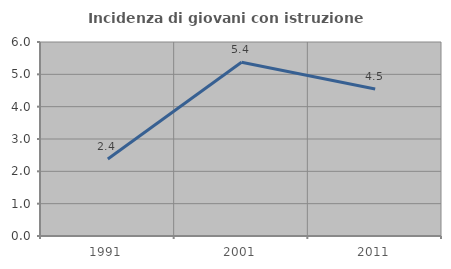
| Category | Incidenza di giovani con istruzione universitaria |
|---|---|
| 1991.0 | 2.381 |
| 2001.0 | 5.376 |
| 2011.0 | 4.545 |